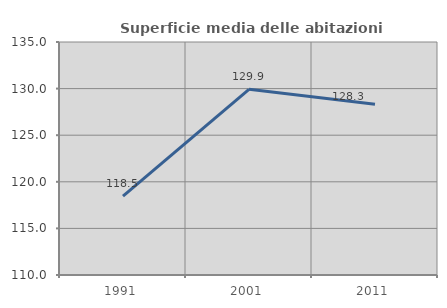
| Category | Superficie media delle abitazioni occupate |
|---|---|
| 1991.0 | 118.457 |
| 2001.0 | 129.922 |
| 2011.0 | 128.316 |